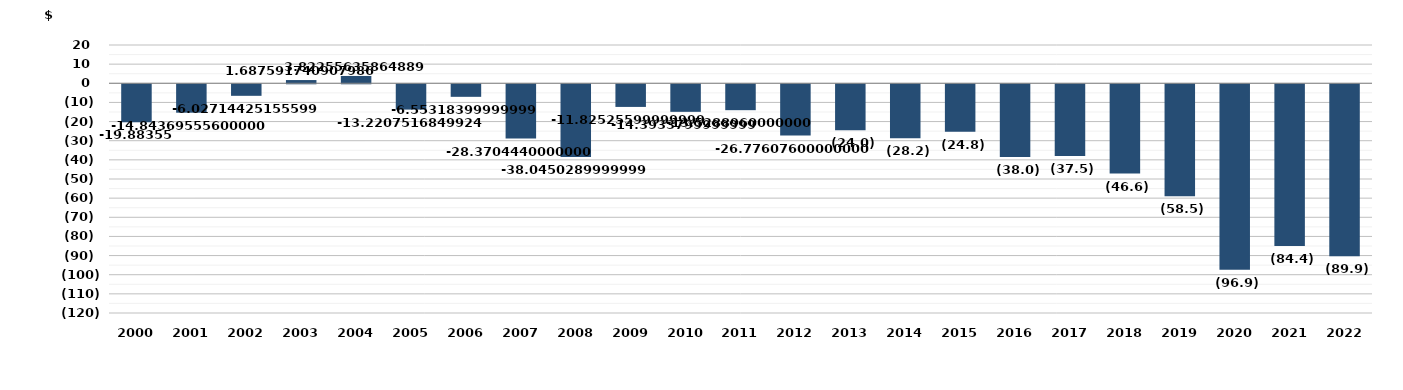
| Category | Series 0 |
|---|---|
| 2000.0 | -19.884 |
| 2001.0 | -14.844 |
| 2002.0 | -6.027 |
| 2003.0 | 1.688 |
| 2004.0 | 3.823 |
| 2005.0 | -13.221 |
| 2006.0 | -6.553 |
| 2007.0 | -28.37 |
| 2008.0 | -38.045 |
| 2009.0 | -11.825 |
| 2010.0 | -14.393 |
| 2011.0 | -13.529 |
| 2012.0 | -26.776 |
| 2013.0 | -24 |
| 2014.0 | -28.222 |
| 2015.0 | -24.825 |
| 2016.0 | -38.045 |
| 2017.0 | -37.495 |
| 2018.0 | -46.623 |
| 2019.0 | -58.522 |
| 2020.0 | -96.944 |
| 2021.0 | -84.432 |
| 2022.0 | -89.897 |